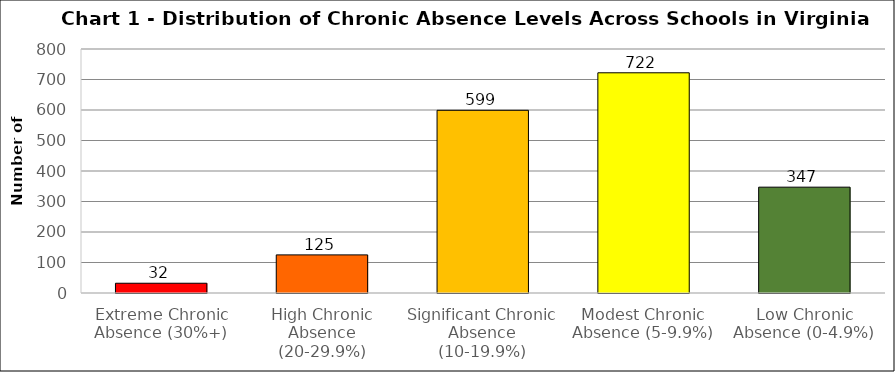
| Category | Series 0 |
|---|---|
| Extreme Chronic Absence (30%+) | 32 |
| High Chronic Absence (20-29.9%) | 125 |
| Significant Chronic Absence (10-19.9%) | 599 |
| Modest Chronic Absence (5-9.9%) | 722 |
| Low Chronic Absence (0-4.9%) | 347 |